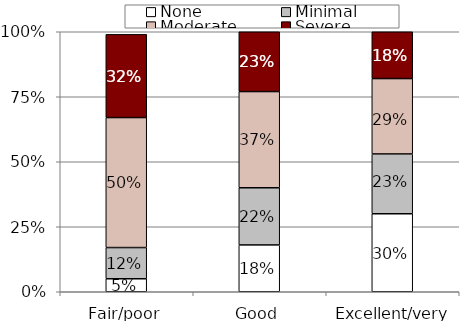
| Category | None | Minimal | Moderate | Severe |
|---|---|---|---|---|
| Fair/poor | 0.05 | 0.12 | 0.5 | 0.32 |
| Good | 0.18 | 0.22 | 0.37 | 0.23 |
| Excellent/very good | 0.3 | 0.23 | 0.29 | 0.18 |